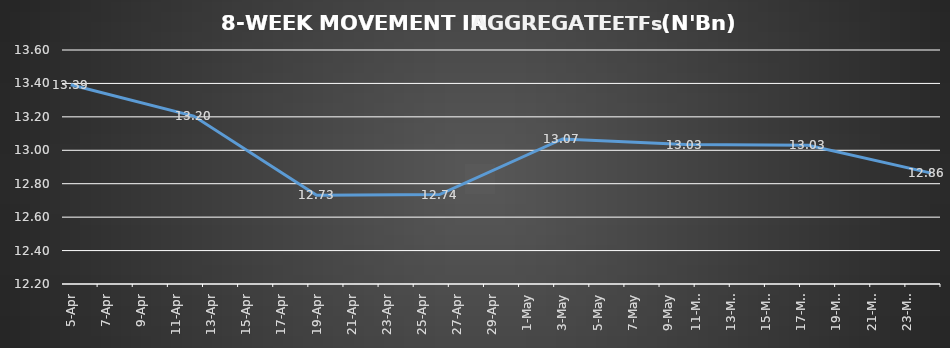
| Category | ETFs AGGREGATE |
|---|---|
| 2024-04-05 | 13.392 |
| 2024-04-12 | 13.205 |
| 2024-04-19 | 12.73 |
| 2024-04-26 | 12.735 |
| 2024-05-03 | 13.068 |
| 2024-05-10 | 13.034 |
| 2024-05-17 | 13.03 |
| 2024-05-24 | 12.863 |